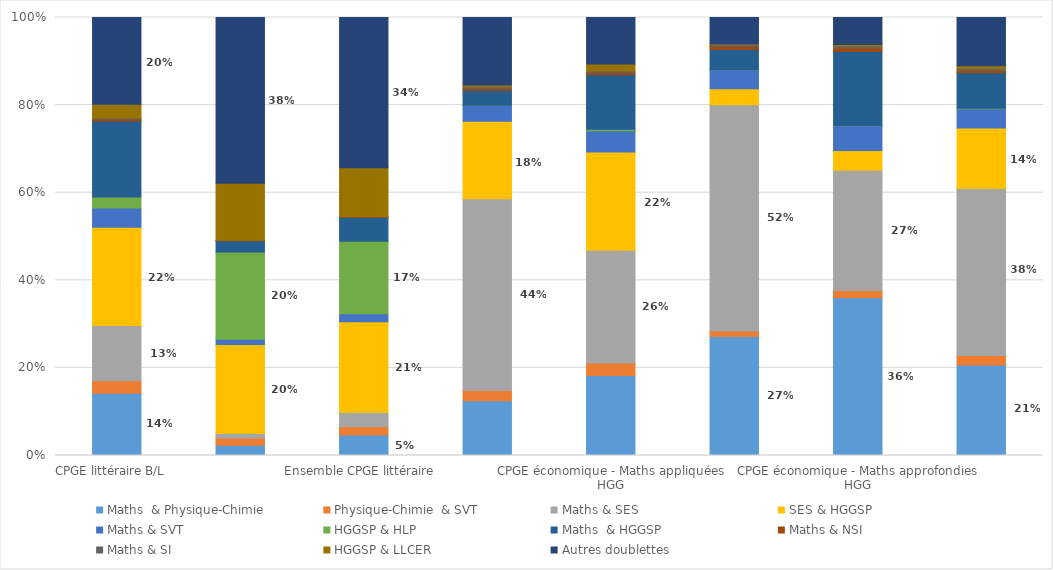
| Category | Maths  & Physique-Chimie  | Physique-Chimie  & SVT | Maths & SES | SES & HGGSP | Maths & SVT | HGGSP & HLP | Maths  & HGGSP | Maths & NSI | Maths & SI | HGGSP & LLCER | Autres doublettes |
|---|---|---|---|---|---|---|---|---|---|---|---|
| CPGE littéraire B/L   | 0.142 | 0.029 | 0.126 | 0.225 | 0.044 | 0.025 | 0.174 | 0.004 | 0.002 | 0.032 | 0.198 |
| CPGE littéraire A/L   | 0.024 | 0.017 | 0.01 | 0.203 | 0.012 | 0.199 | 0.025 | 0.001 | 0 | 0.13 | 0.379 |
| Ensemble CPGE littéraire  | 0.047 | 0.019 | 0.033 | 0.207 | 0.018 | 0.165 | 0.054 | 0.002 | 0.001 | 0.111 | 0.343 |
| CPGE économique - Maths appliquées ESH | 0.125 | 0.024 | 0.438 | 0.177 | 0.036 | 0.001 | 0.033 | 0.005 | 0.004 | 0.004 | 0.154 |
| CPGE économique - Maths appliquées HGG | 0.182 | 0.029 | 0.257 | 0.224 | 0.049 | 0.003 | 0.125 | 0.005 | 0.004 | 0.016 | 0.106 |
| CPGE économique - Maths approfondie ESH | 0.271 | 0.013 | 0.517 | 0.036 | 0.043 | 0 | 0.046 | 0.007 | 0.005 | 0.001 | 0.06 |
| CPGE économique - Maths approfondies HGG | 0.36 | 0.016 | 0.275 | 0.045 | 0.056 | 0.001 | 0.169 | 0.008 | 0.004 | 0.004 | 0.062 |
| Ensemble CPGE économique et commerciales | 0.207 | 0.022 | 0.381 | 0.138 | 0.044 | 0.001 | 0.081 | 0.006 | 0.004 | 0.006 | 0.11 |